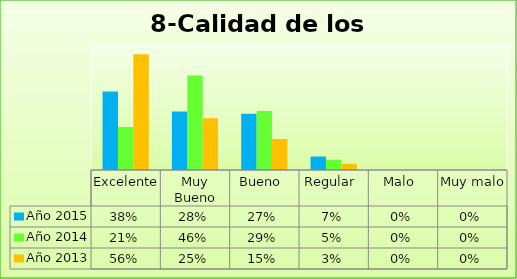
| Category | Año 2015 | Año 2014 | Año 2013 |
|---|---|---|---|
| Excelente | 0.379 | 0.208 | 0.56 |
| Muy Bueno | 0.284 | 0.457 | 0.25 |
| Bueno  | 0.272 | 0.286 | 0.15 |
| Regular  | 0.065 | 0.049 | 0.03 |
| Malo  | 0 | 0 | 0 |
| Muy malo  | 0 | 0 | 0 |